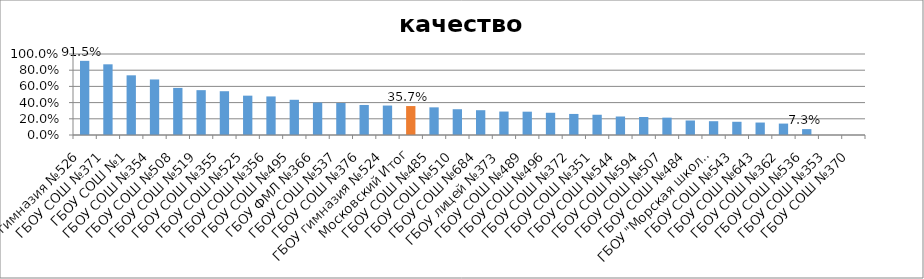
| Category | качество знаний |
|---|---|
| ГБОУ гимназия №526 | 0.915 |
| ГБОУ СОШ №371 | 0.873 |
| ГБОУ СОШ №1 | 0.737 |
| ГБОУ СОШ №354 | 0.686 |
| ГБОУ СОШ №508 | 0.581 |
| ГБОУ СОШ №519 | 0.554 |
| ГБОУ СОШ №355 | 0.541 |
| ГБОУ СОШ №525 | 0.486 |
| ГБОУ СОШ №356 | 0.476 |
| ГБОУ СОШ №495 | 0.435 |
| ГБОУ ФМЛ №366 | 0.4 |
| ГБОУ СОШ №537 | 0.395 |
| ГБОУ СОШ №376 | 0.371 |
| ГБОУ гимназия №524 | 0.364 |
| Московский Итог | 0.357 |
| ГБОУ СОШ №485 | 0.341 |
| ГБОУ СОШ №510 | 0.318 |
| ГБОУ СОШ №684 | 0.306 |
| ГБОУ лицей №373 | 0.289 |
| ГБОУ СОШ №489 | 0.288 |
| ГБОУ СОШ №496 | 0.275 |
| ГБОУ СОШ №372 | 0.26 |
| ГБОУ СОШ №351 | 0.25 |
| ГБОУ СОШ №544 | 0.228 |
| ГБОУ СОШ №594 | 0.222 |
| ГБОУ СОШ №507 | 0.214 |
| ГБОУ СОШ №484 | 0.179 |
| ГБОУ "Морская школа" | 0.17 |
| ГБОУ СОШ №543 | 0.163 |
| ГБОУ СОШ №643 | 0.154 |
| ГБОУ СОШ №362 | 0.141 |
| ГБОУ СОШ №536 | 0.073 |
| ГБОУ СОШ №353 | 0 |
| ГБОУ СОШ №370 | 0 |